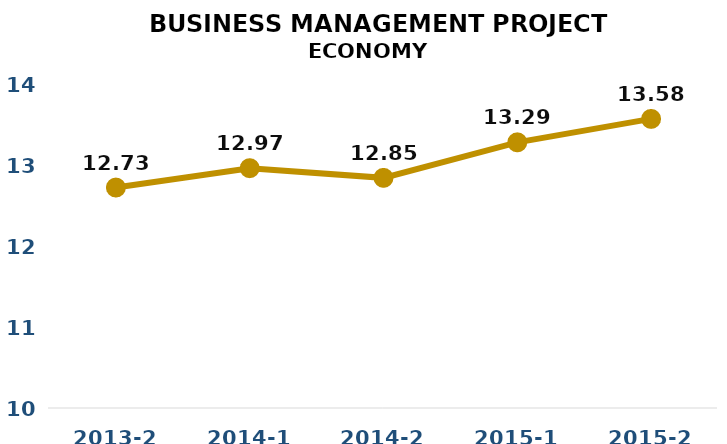
| Category | Series 0 |
|---|---|
| 2013-2 | 12.73 |
| 2014-1 | 12.97 |
| 2014-2 | 12.85 |
| 2015-1 | 13.29 |
| 2015-2 | 13.58 |